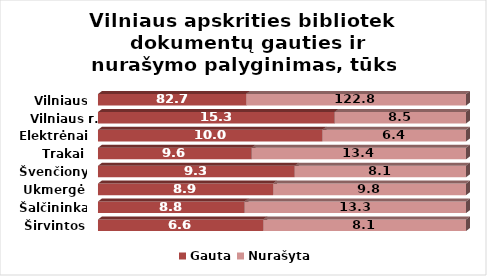
| Category | Gauta | Nurašyta |
|---|---|---|
| Širvintos | 6.6 | 8.1 |
| Šalčininkai | 8.8 | 13.3 |
| Ukmergė | 8.9 | 9.8 |
| Švenčionys | 9.3 | 8.1 |
| Trakai | 9.6 | 13.4 |
| Elektrėnai | 10 | 6.4 |
| Vilniaus r. | 15.3 | 8.5 |
| Vilniaus m. | 82.7 | 122.8 |